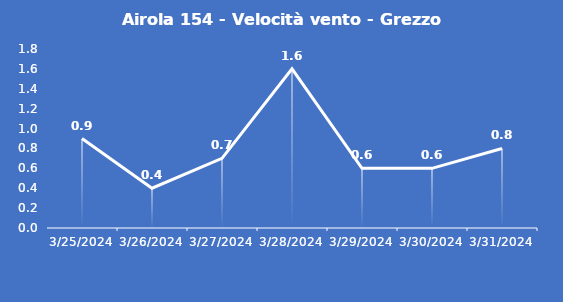
| Category | Airola 154 - Velocità vento - Grezzo (m/s) |
|---|---|
| 3/25/24 | 0.9 |
| 3/26/24 | 0.4 |
| 3/27/24 | 0.7 |
| 3/28/24 | 1.6 |
| 3/29/24 | 0.6 |
| 3/30/24 | 0.6 |
| 3/31/24 | 0.8 |